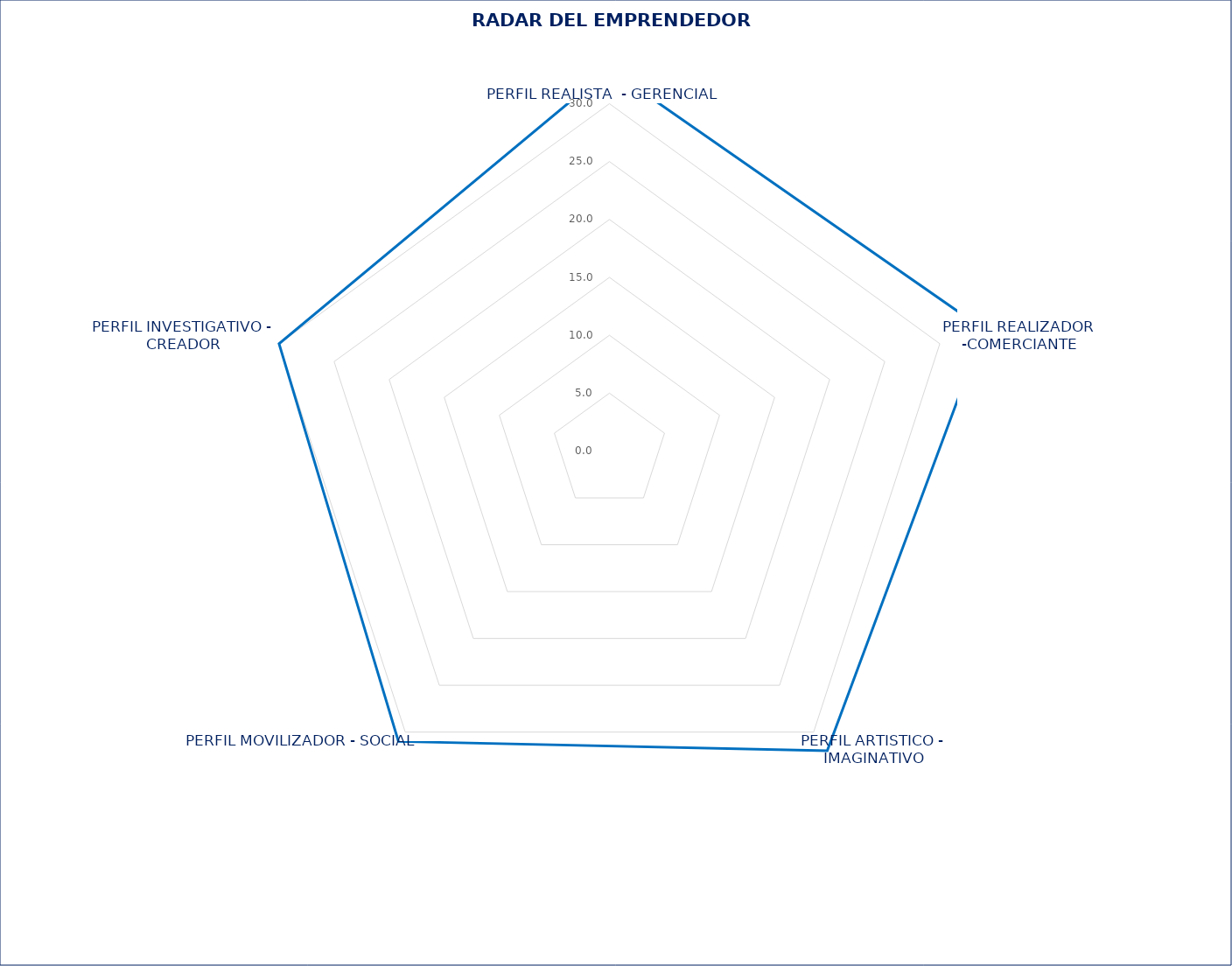
| Category | Series 0 |
|---|---|
| PERFIL REALISTA  - GERENCIAL  | 33 |
| PERFIL REALIZADOR -COMERCIANTE | 34 |
| PERFIL ARTISTICO - IMAGINATIVO | 32 |
| PERFIL MOVILIZADOR - SOCIAL  | 31 |
| PERFIL INVESTIGATIVO - CREADOR | 30 |